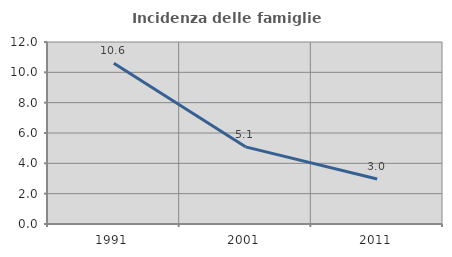
| Category | Incidenza delle famiglie numerose |
|---|---|
| 1991.0 | 10.592 |
| 2001.0 | 5.087 |
| 2011.0 | 2.967 |